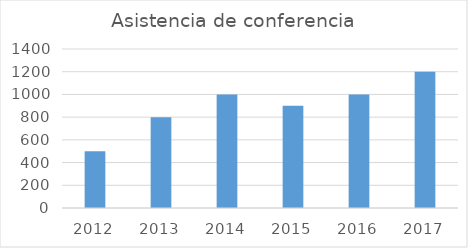
| Category | Asistencia de conferencia |
|---|---|
| 2012.0 | 500 |
| 2013.0 | 800 |
| 2014.0 | 1000 |
| 2015.0 | 900 |
| 2016.0 | 1000 |
| 2017.0 | 1200 |